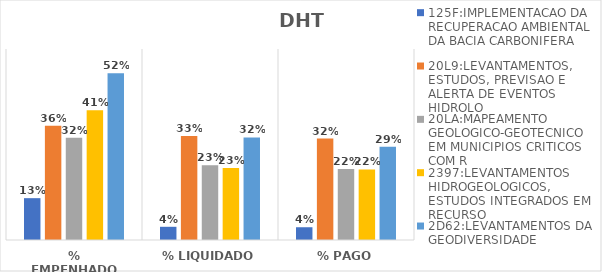
| Category | 125F:IMPLEMENTACAO DA RECUPERACAO AMBIENTAL DA BACIA CARBONIFERA | 20L9:LEVANTAMENTOS, ESTUDOS, PREVISAO E ALERTA DE EVENTOS HIDROLO | 20LA:MAPEAMENTO GEOLOGICO-GEOTECNICO EM MUNICIPIOS CRITICOS COM R | 2397:LEVANTAMENTOS HIDROGEOLOGICOS, ESTUDOS INTEGRADOS EM RECURSO | 2D62:LEVANTAMENTOS DA GEODIVERSIDADE |
|---|---|---|---|---|---|
| % EMPENHADO | 0.131 | 0.359 | 0.322 | 0.408 | 0.524 |
| % LIQUIDADO | 0.041 | 0.326 | 0.235 | 0.226 | 0.322 |
| % PAGO | 0.04 | 0.319 | 0.223 | 0.222 | 0.293 |